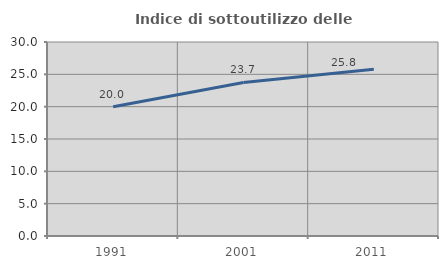
| Category | Indice di sottoutilizzo delle abitazioni  |
|---|---|
| 1991.0 | 20 |
| 2001.0 | 23.747 |
| 2011.0 | 25.768 |